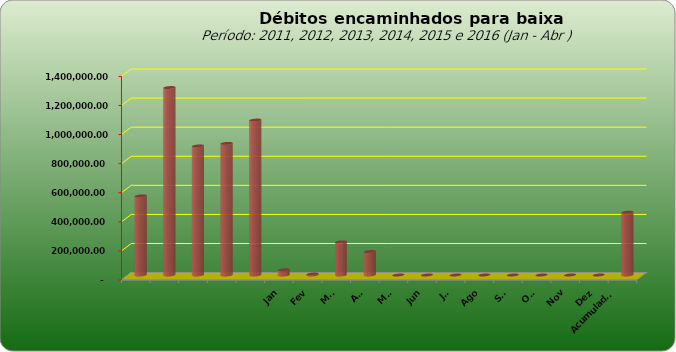
| Category |  543.796,20  |
|---|---|
|  | 543796.2 |
|  | 1289053.69 |
|  | 887573.08 |
|  | 905052.31 |
|  | 1065434.28 |
| Jan | 35964.03 |
| Fev | 6417.54 |
| Mar | 227804.72 |
| Abr | 161576.79 |
| Mai | 0 |
| Jun | 0 |
| Jul | 0 |
| Ago | 0 |
| Set | 0 |
| Out | 0 |
| Nov | 0 |
| Dez | 0 |
| Acumulado
2016 | 431763.08 |